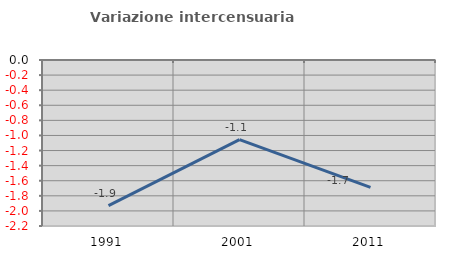
| Category | Variazione intercensuaria annua |
|---|---|
| 1991.0 | -1.93 |
| 2001.0 | -1.055 |
| 2011.0 | -1.689 |